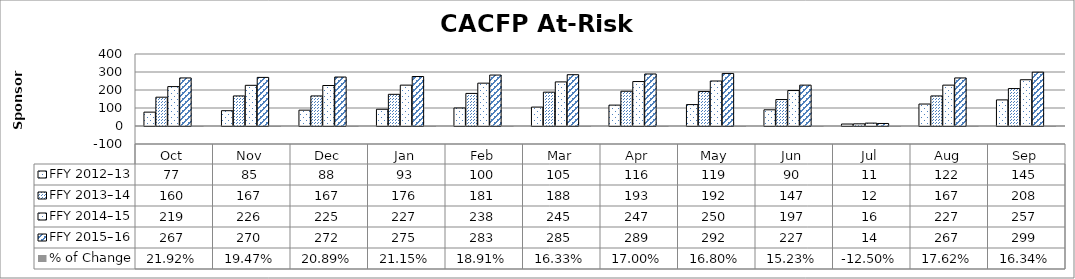
| Category | FFY 2012–13 | FFY 2013–14 | FFY 2014–15 | FFY 2015–16 | % of Change |
|---|---|---|---|---|---|
| _x0003_Oct | 77 | 160 | 219 | 267 | 0.219 |
| _x0003_Nov | 85 | 167 | 226 | 270 | 0.195 |
| _x0003_Dec | 88 | 167 | 225 | 272 | 0.209 |
| _x0003_Jan | 93 | 176 | 227 | 275 | 0.211 |
| _x0003_Feb | 100 | 181 | 238 | 283 | 0.189 |
| _x0003_Mar | 105 | 188 | 245 | 285 | 0.163 |
| _x0003_Apr | 116 | 193 | 247 | 289 | 0.17 |
| _x0003_May | 119 | 192 | 250 | 292 | 0.168 |
| _x0003_Jun | 90 | 147 | 197 | 227 | 0.152 |
| _x0003_Jul | 11 | 12 | 16 | 14 | -0.125 |
| _x0003_Aug | 122 | 167 | 227 | 267 | 0.176 |
| _x0003_Sep | 145 | 208 | 257 | 299 | 0.163 |